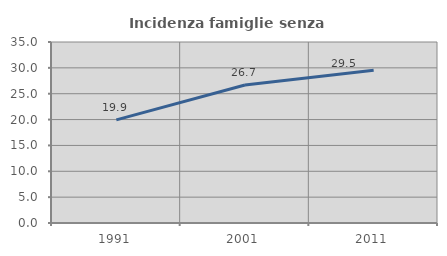
| Category | Incidenza famiglie senza nuclei |
|---|---|
| 1991.0 | 19.94 |
| 2001.0 | 26.682 |
| 2011.0 | 29.533 |